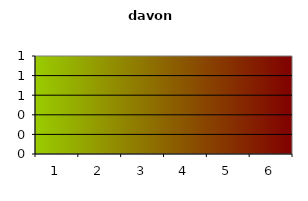
| Category | Series 0 |
|---|---|
| 1 | 0 |
| 2 | 0 |
| 3 | 0 |
| 4 | 0 |
| 5 | 0 |
| 6 | 0 |